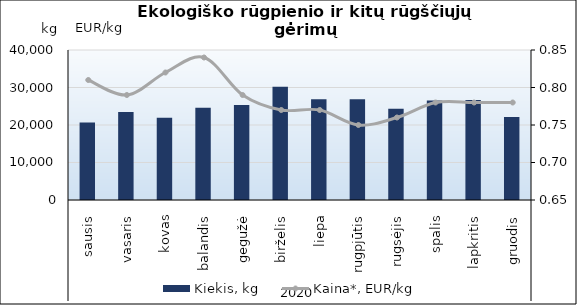
| Category | Kiekis, kg |
|---|---|
| 0 | 20698 |
| 1 | 23452 |
| 2 | 21951 |
| 3 | 24604 |
| 4 | 25358 |
| 5 | 30190 |
| 6 | 26843 |
| 7 | 26886 |
| 8 | 24356 |
| 9 | 26519 |
| 10 | 26650 |
| 11 | 22151 |